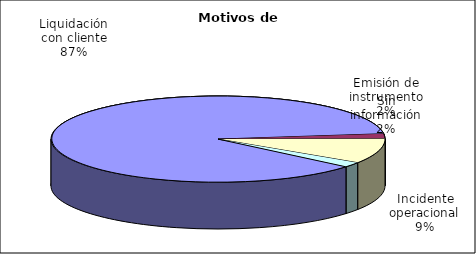
| Category | Motivos |
|---|---|
| Liquidación con cliente | 418 |
| Emisión de instrumento | 9 |
| Incidente operacional | 45 |
| Sin información | 9 |